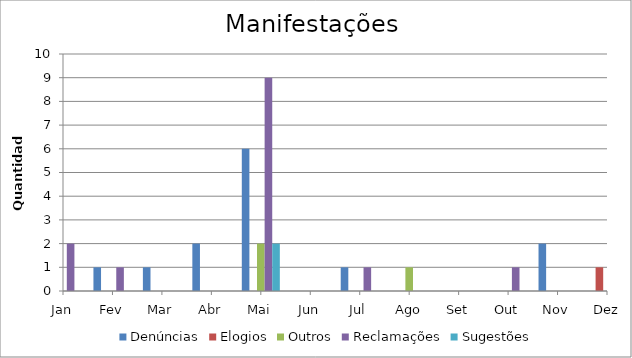
| Category | Denúncias | Elogios | Outros | Reclamações | Sugestões |
|---|---|---|---|---|---|
| Jan | 1 | 1 | 0 | 2 | 0 |
| Fev | 1 | 0 | 0 | 1 | 0 |
| Mar | 1 | 0 | 0 | 0 | 0 |
| Abr | 2 | 0 | 0 | 0 | 0 |
| Mai | 6 | 0 | 2 | 9 | 2 |
| Jun | 0 | 0 | 0 | 0 | 0 |
| Jul | 1 | 0 | 0 | 1 | 0 |
| Ago | 0 | 0 | 1 | 0 | 0 |
| Set | 0 | 0 | 0 | 0 | 0 |
| Out | 0 | 0 | 0 | 1 | 0 |
| Nov | 2 | 0 | 0 | 0 | 0 |
| Dez | 0 | 1 | 0 | 1 | 0 |